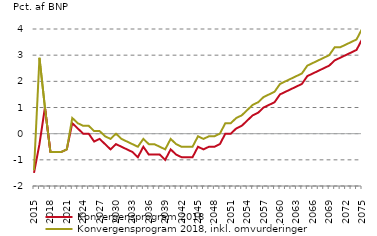
| Category | nul-linje | Konvergensprogram 2018  | Konvergensprogram 2018, inkl. omvurderinger  |
|---|---|---|---|
| 2015.0 | 0 | -1.5 | -1.4 |
| 2016.0 | 0 | -0.4 | 2.9 |
| 2017.0 | 0 | 1 | 1 |
| 2018.0 | 0 | -0.7 | -0.7 |
| 2019.0 | 0 | -0.7 | -0.7 |
| 2020.0 | 0 | -0.7 | -0.7 |
| 2021.0 | 0 | -0.6 | -0.6 |
| 2022.0 | 0 | 0.4 | 0.6 |
| 2023.0 | 0 | 0.2 | 0.4 |
| 2024.0 | 0 | 0 | 0.3 |
| 2025.0 | 0 | 0 | 0.3 |
| 2026.0 | 0 | -0.3 | 0.1 |
| 2027.0 | 0 | -0.2 | 0.1 |
| 2028.0 | 0 | -0.4 | -0.1 |
| 2029.0 | 0 | -0.6 | -0.2 |
| 2030.0 | 0 | -0.4 | 0 |
| 2031.0 | 0 | -0.5 | -0.2 |
| 2032.0 | 0 | -0.6 | -0.3 |
| 2033.0 | 0 | -0.7 | -0.4 |
| 2034.0 | 0 | -0.9 | -0.5 |
| 2035.0 | 0 | -0.5 | -0.2 |
| 2036.0 | 0 | -0.8 | -0.4 |
| 2037.0 | 0 | -0.8 | -0.4 |
| 2038.0 | 0 | -0.8 | -0.5 |
| 2039.0 | 0 | -1 | -0.6 |
| 2040.0 | 0 | -0.6 | -0.2 |
| 2041.0 | 0 | -0.8 | -0.4 |
| 2042.0 | 0 | -0.9 | -0.5 |
| 2043.0 | 0 | -0.9 | -0.5 |
| 2044.0 | 0 | -0.9 | -0.5 |
| 2045.0 | 0 | -0.5 | -0.1 |
| 2046.0 | 0 | -0.6 | -0.2 |
| 2047.0 | 0 | -0.5 | -0.1 |
| 2048.0 | 0 | -0.5 | -0.1 |
| 2049.0 | 0 | -0.4 | 0 |
| 2050.0 | 0 | 0 | 0.4 |
| 2051.0 | 0 | 0 | 0.4 |
| 2052.0 | 0 | 0.2 | 0.6 |
| 2053.0 | 0 | 0.3 | 0.7 |
| 2054.0 | 0 | 0.5 | 0.9 |
| 2055.0 | 0 | 0.7 | 1.1 |
| 2056.0 | 0 | 0.8 | 1.2 |
| 2057.0 | 0 | 1 | 1.4 |
| 2058.0 | 0 | 1.1 | 1.5 |
| 2059.0 | 0 | 1.2 | 1.6 |
| 2060.0 | 0 | 1.5 | 1.9 |
| 2061.0 | 0 | 1.6 | 2 |
| 2062.0 | 0 | 1.7 | 2.1 |
| 2063.0 | 0 | 1.8 | 2.2 |
| 2064.0 | 0 | 1.9 | 2.3 |
| 2065.0 | 0 | 2.2 | 2.6 |
| 2066.0 | 0 | 2.3 | 2.7 |
| 2067.0 | 0 | 2.4 | 2.8 |
| 2068.0 | 0 | 2.5 | 2.9 |
| 2069.0 | 0 | 2.6 | 3 |
| 2070.0 | 0 | 2.8 | 3.3 |
| 2071.0 | 0 | 2.9 | 3.3 |
| 2072.0 | 0 | 3 | 3.4 |
| 2073.0 | 0 | 3.1 | 3.5 |
| 2074.0 | 0 | 3.2 | 3.6 |
| 2075.0 | 0 | 3.6 | 4 |